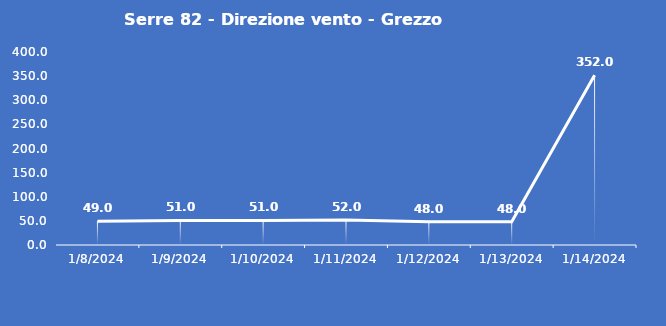
| Category | Serre 82 - Direzione vento - Grezzo (°N) |
|---|---|
| 1/8/24 | 49 |
| 1/9/24 | 51 |
| 1/10/24 | 51 |
| 1/11/24 | 52 |
| 1/12/24 | 48 |
| 1/13/24 | 48 |
| 1/14/24 | 352 |